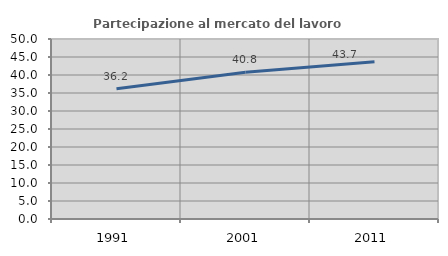
| Category | Partecipazione al mercato del lavoro  femminile |
|---|---|
| 1991.0 | 36.151 |
| 2001.0 | 40.78 |
| 2011.0 | 43.696 |